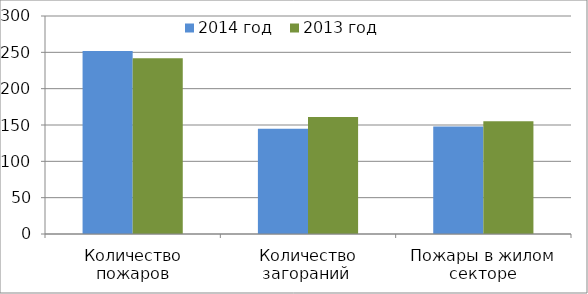
| Category | 2014 год | 2013 год |
|---|---|---|
| Количество пожаров | 252 | 242 |
| Количество загораний  | 145 | 161 |
| Пожары в жилом секторе | 148 | 155 |